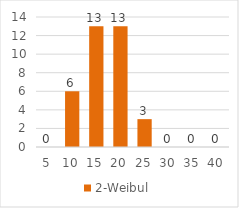
| Category | 2-Weibul |
|---|---|
| 5.0 | 0 |
| 10.0 | 6 |
| 15.0 | 13 |
| 20.0 | 13 |
| 25.0 | 3 |
| 30.0 | 0 |
| 35.0 | 0 |
| 40.0 | 0 |